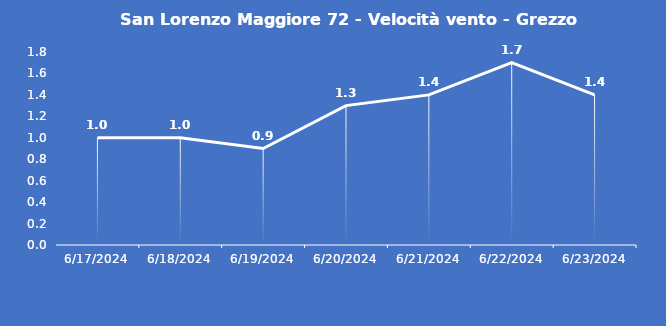
| Category | San Lorenzo Maggiore 72 - Velocità vento - Grezzo (m/s) |
|---|---|
| 6/17/24 | 1 |
| 6/18/24 | 1 |
| 6/19/24 | 0.9 |
| 6/20/24 | 1.3 |
| 6/21/24 | 1.4 |
| 6/22/24 | 1.7 |
| 6/23/24 | 1.4 |